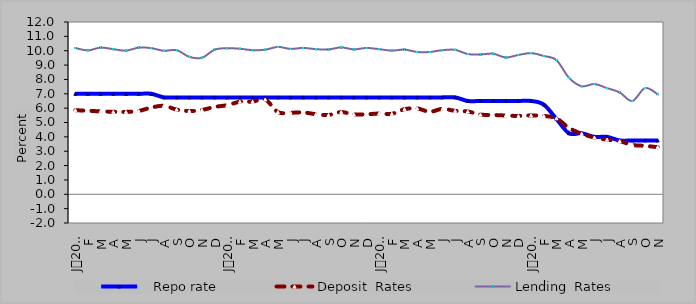
| Category |    Repo rate | Deposit  Rates  | Lending  Rates  |
|---|---|---|---|
| 0 | 7 | 5.858 | 10.187 |
| 1900-01-01 | 7 | 5.815 | 10.024 |
| 1900-01-02 | 7 | 5.776 | 10.218 |
| 1900-01-03 | 7 | 5.746 | 10.107 |
| 1900-01-04 | 7 | 5.74 | 10.004 |
| 1900-01-05 | 7 | 5.804 | 10.214 |
| 1900-01-06 | 7 | 6.04 | 10.18 |
| 1900-01-07 | 6.75 | 6.162 | 9.994 |
| 1900-01-08 | 6.75 | 5.898 | 10.042 |
| 1900-01-09 | 6.75 | 5.801 | 9.572 |
| 1900-01-10 | 6.75 | 5.871 | 9.508 |
| 1900-01-11 | 6.75 | 6.087 | 10.07 |
| 1900-01-12 | 6.75 | 6.207 | 10.174 |
| 1900-01-13 | 6.75 | 6.446 | 10.136 |
| 1900-01-14 | 6.75 | 6.452 | 10.039 |
| 1900-01-15 | 6.75 | 6.6 | 10.069 |
| 1900-01-16 | 6.75 | 5.728 | 10.265 |
| 1900-01-17 | 6.75 | 5.682 | 10.125 |
| 1900-01-18 | 6.75 | 5.701 | 10.195 |
| 1900-01-19 | 6.75 | 5.579 | 10.107 |
| 1900-01-20 | 6.75 | 5.521 | 10.088 |
| 1900-01-21 | 6.75 | 5.728 | 10.234 |
| 1900-01-22 | 6.75 | 5.56 | 10.092 |
| 1900-01-23 | 6.75 | 5.572 | 10.192 |
| 1900-01-24 | 6.75 | 5.626 | 10.109 |
| 1900-01-25 | 6.75 | 5.605 | 10.006 |
| 1900-01-26 | 6.75 | 5.926 | 10.08 |
| 1900-01-27 | 6.75 | 5.979 | 9.914 |
| 1900-01-28 | 6.75 | 5.749 | 9.911 |
| 1900-01-29 | 6.75 | 5.95 | 10.038 |
| 1900-01-30 | 6.75 | 5.811 | 10.061 |
| 1900-01-31 | 6.5 | 5.767 | 9.769 |
| 1900-02-01 | 6.5 | 5.55 | 9.74 |
| 1900-02-02 | 6.5 | 5.523 | 9.793 |
| 1900-02-03 | 6.5 | 5.486 | 9.53 |
| 1900-02-04 | 6.5 | 5.455 | 9.704 |
| 1900-02-05 | 6.5 | 5.497 | 9.833 |
| 1900-02-06 | 6.25 | 5.454 | 9.634 |
| 1900-02-07 | 5.25 | 5.29 | 9.35 |
| 1900-02-08 | 4.25 | 4.617 | 8.106 |
| 1900-02-09 | 4.25 | 4.216 | 7.526 |
| 1900-02-10 | 4 | 3.953 | 7.68 |
| 1900-02-11 | 4 | 3.808 | 7.395 |
| 1900-02-12 | 3.75 | 3.699 | 7.095 |
| 1900-02-13 | 3.75 | 3.437 | 6.495 |
| 1900-02-14 | 3.75 | 3.374 | 7.402 |
| 1900-02-15 | 3.75 | 3.28 | 6.97 |